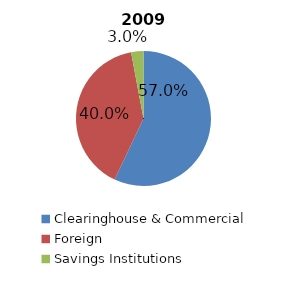
| Category | Series 0 |
|---|---|
| Clearinghouse & Commercial | 419446096 |
| Foreign | 294231431 |
| Savings Institutions | 21703903 |